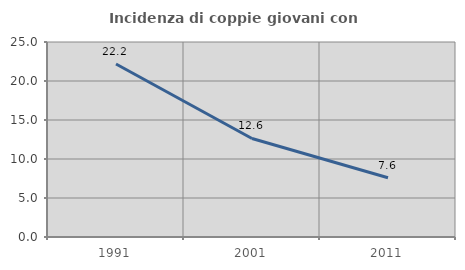
| Category | Incidenza di coppie giovani con figli |
|---|---|
| 1991.0 | 22.183 |
| 2001.0 | 12.635 |
| 2011.0 | 7.588 |